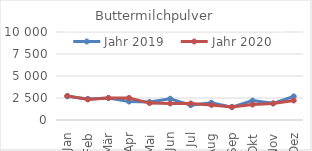
| Category | Jahr 2019 | Jahr 2020 |
|---|---|---|
| Jan | 2687.386 | 2740.808 |
| Feb | 2399.851 | 2342.068 |
| Mär | 2501.549 | 2503.938 |
| Apr | 2099.177 | 2509.503 |
| Mai | 2057.338 | 1918.116 |
| Jun | 2418.166 | 1876.807 |
| Jul | 1680.47 | 1880.474 |
| Aug | 1961.036 | 1708.217 |
| Sep | 1456.988 | 1492.162 |
| Okt | 2210.146 | 1750.528 |
| Nov | 1891.286 | 1882.071 |
| Dez | 2682.027 | 2216.35 |